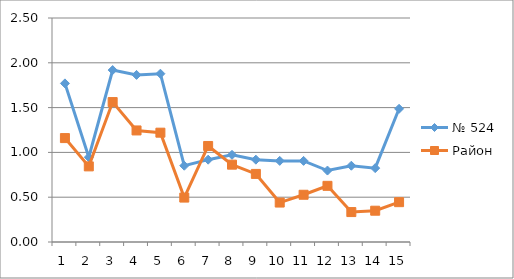
| Category | № 524 | Район |
|---|---|---|
| 0 | 1.77 | 1.16 |
| 1 | 0.946 | 0.844 |
| 2 | 1.919 | 1.562 |
| 3 | 1.865 | 1.245 |
| 4 | 1.878 | 1.22 |
| 5 | 0.851 | 0.496 |
| 6 | 0.919 | 1.072 |
| 7 | 0.973 | 0.863 |
| 8 | 0.919 | 0.76 |
| 9 | 0.905 | 0.44 |
| 10 | 0.905 | 0.527 |
| 11 | 0.797 | 0.627 |
| 12 | 0.851 | 0.334 |
| 13 | 0.824 | 0.349 |
| 14 | 1.486 | 0.445 |